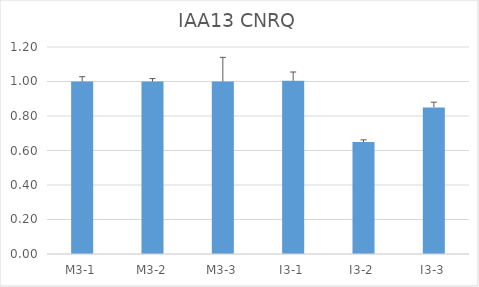
| Category | IAA13 CNRQ |
|---|---|
| M3-1 | 1 |
| M3-2 | 1 |
| M3-3 | 1 |
| I3-1 | 1.004 |
| I3-2 | 0.649 |
| I3-3 | 0.85 |